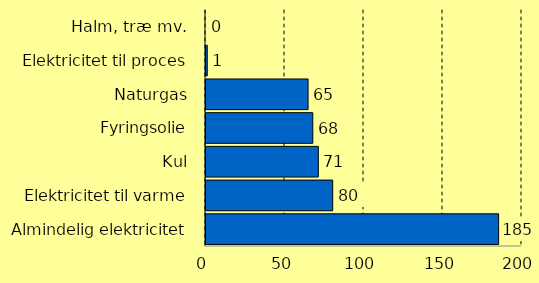
| Category | Series 0 |
|---|---|
| Almindelig elektricitet | 185.2 |
| Elektricitet til varme | 80.2 |
| Kul | 71.1 |
| Fyringsolie | 67.6 |
| Naturgas | 64.6 |
| Elektricitet til proces | 0.8 |
| Halm, træ mv. | 0 |